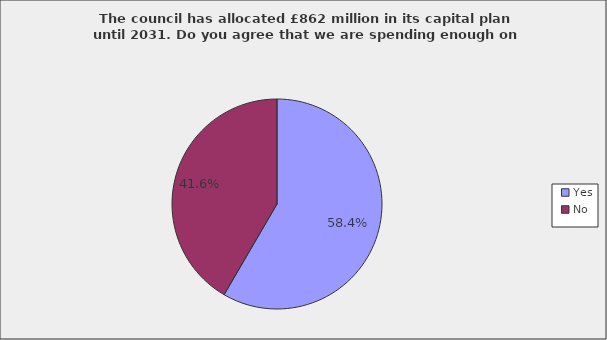
| Category | Series 0 |
|---|---|
| Yes | 0.584 |
| No | 0.416 |